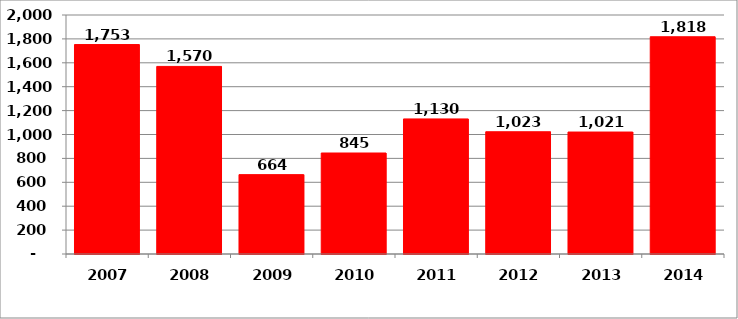
| Category | Series 1 |
|---|---|
| 2007.0 | 1752.646 |
| 2008.0 | 1569.723 |
| 2009.0 | 664.191 |
| 2010.0 | 845.114 |
| 2011.0 | 1130.263 |
| 2012.0 | 1022.928 |
| 2013.0 | 1020.634 |
| 2014.0 | 1817.981 |